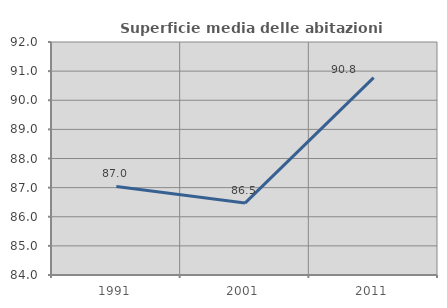
| Category | Superficie media delle abitazioni occupate |
|---|---|
| 1991.0 | 87.039 |
| 2001.0 | 86.47 |
| 2011.0 | 90.776 |